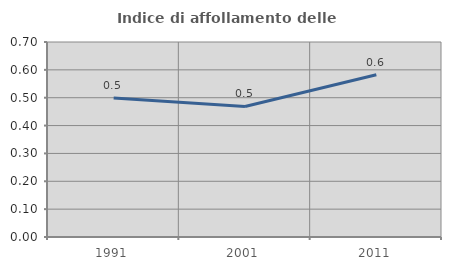
| Category | Indice di affollamento delle abitazioni  |
|---|---|
| 1991.0 | 0.499 |
| 2001.0 | 0.469 |
| 2011.0 | 0.582 |